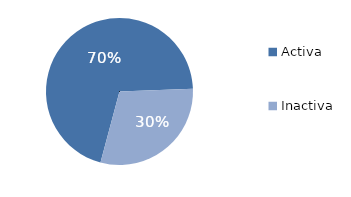
| Category | Series 0 |
|---|---|
| Activa | 4599.07 |
| Inactiva | 1947.266 |